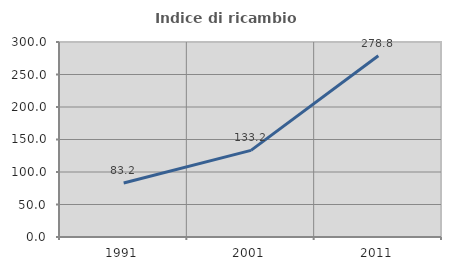
| Category | Indice di ricambio occupazionale  |
|---|---|
| 1991.0 | 83.152 |
| 2001.0 | 133.222 |
| 2011.0 | 278.75 |